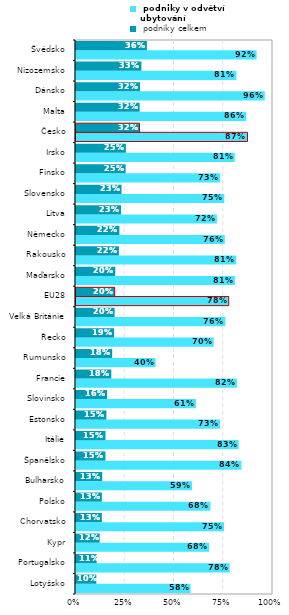
| Category |  podniky v odvětví ubytování |  podniky celkem |
|---|---|---|
| Lotyšsko | 0.581 | 0.103 |
| Portugalsko | 0.78 | 0.105 |
| Kypr | 0.676 | 0.12 |
| Chorvatsko | 0.752 | 0.131 |
| Polsko | 0.683 | 0.131 |
| Bulharsko | 0.589 | 0.133 |
| Španělsko | 0.84 | 0.149 |
| Itálie | 0.826 | 0.15 |
| Estonsko | 0.731 | 0.154 |
| Slovinsko | 0.609 | 0.158 |
| Francie | 0.817 | 0.179 |
| Rumunsko | 0.404 | 0.184 |
| Řecko | 0.699 | 0.193 |
| Velká Británie | 0.758 | 0.196 |
| EU28 | 0.775 | 0.196 |
| Maďarsko | 0.806 | 0.199 |
| Rakousko | 0.813 | 0.218 |
| Německo | 0.755 | 0.22 |
| Litva | 0.715 | 0.229 |
| Slovensko | 0.753 | 0.231 |
| Finsko | 0.731 | 0.252 |
| Irsko | 0.806 | 0.253 |
| Česko | 0.87 | 0.323 |
| Malta | 0.864 | 0.323 |
| Dánsko | 0.958 | 0.325 |
| Nizozemsko | 0.814 | 0.332 |
| Švédsko | 0.917 | 0.36 |